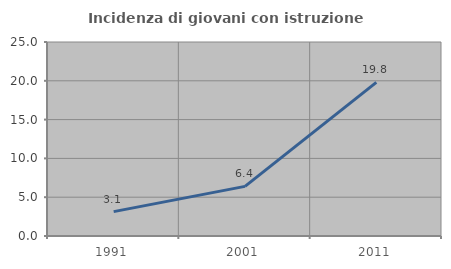
| Category | Incidenza di giovani con istruzione universitaria |
|---|---|
| 1991.0 | 3.138 |
| 2001.0 | 6.395 |
| 2011.0 | 19.802 |